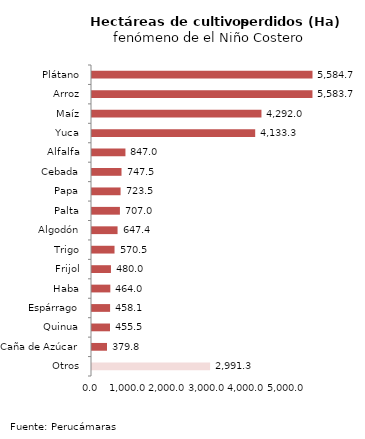
| Category | Series 0 |
|---|---|
| Plátano | 5584.7 |
| Arroz | 5583.7 |
| Maíz | 4292.01 |
| Yuca | 4133.26 |
| Alfalfa | 847 |
| Cebada | 747.5 |
| Papa | 723.5 |
| Palta | 707.03 |
| Algodón | 647.37 |
| Trigo | 570.5 |
| Frijol | 480.02 |
| Haba | 464 |
| Espárrago | 458.12 |
| Quinua | 455.5 |
| Caña de Azúcar | 379.8 |
| Otros | 2991.32 |